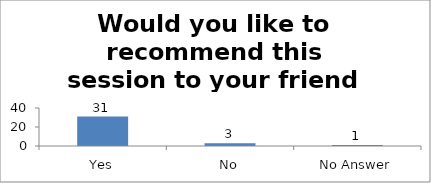
| Category | Would you like to recommend this session to your friend or colleague? |
|---|---|
| Yes | 31 |
| No | 3 |
| No Answer | 1 |